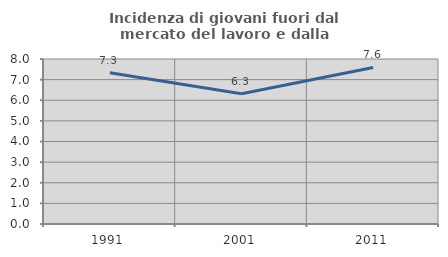
| Category | Incidenza di giovani fuori dal mercato del lavoro e dalla formazione  |
|---|---|
| 1991.0 | 7.336 |
| 2001.0 | 6.316 |
| 2011.0 | 7.588 |